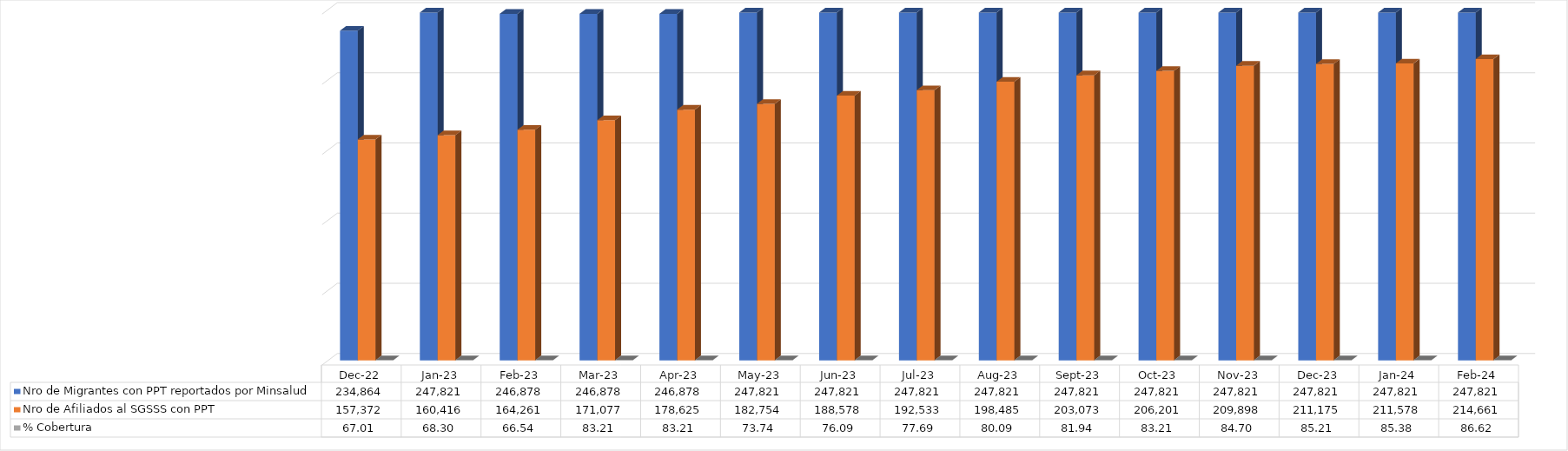
| Category | Nro de Migrantes con PPT reportados por Minsalud  | Nro de Afiliados al SGSSS con PPT | % Cobertura |
|---|---|---|---|
| 2022-12-01 | 234864 | 157372 | 67.006 |
| 2023-01-01 | 247821 | 160416 | 68.302 |
| 2023-02-01 | 246878 | 164261 | 66.535 |
| 2023-03-01 | 246878 | 171077 | 83.206 |
| 2023-04-01 | 246878 | 178625 | 83.206 |
| 2023-05-01 | 247821 | 182754 | 73.744 |
| 2023-06-01 | 247821 | 188578 | 76.094 |
| 2023-07-01 | 247821 | 192533 | 77.69 |
| 2023-08-01 | 247821 | 198485 | 80.092 |
| 2023-09-01 | 247821 | 203073 | 81.943 |
| 2023-10-01 | 247821 | 206201 | 83.206 |
| 2023-11-01 | 247821 | 209898 | 84.697 |
| 2023-12-01 | 247821 | 211175 | 85.213 |
| 2024-01-01 | 247821 | 211578 | 85.375 |
| 2024-02-01 | 247821 | 214661 | 86.619 |